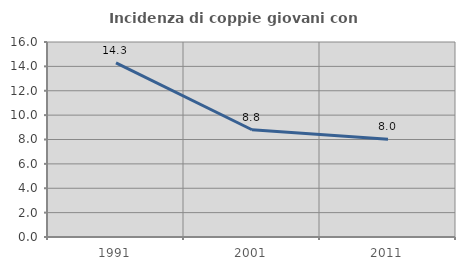
| Category | Incidenza di coppie giovani con figli |
|---|---|
| 1991.0 | 14.286 |
| 2001.0 | 8.8 |
| 2011.0 | 8.029 |